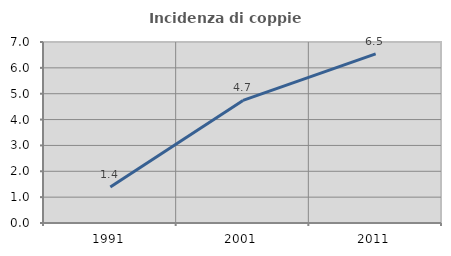
| Category | Incidenza di coppie miste |
|---|---|
| 1991.0 | 1.395 |
| 2001.0 | 4.739 |
| 2011.0 | 6.542 |